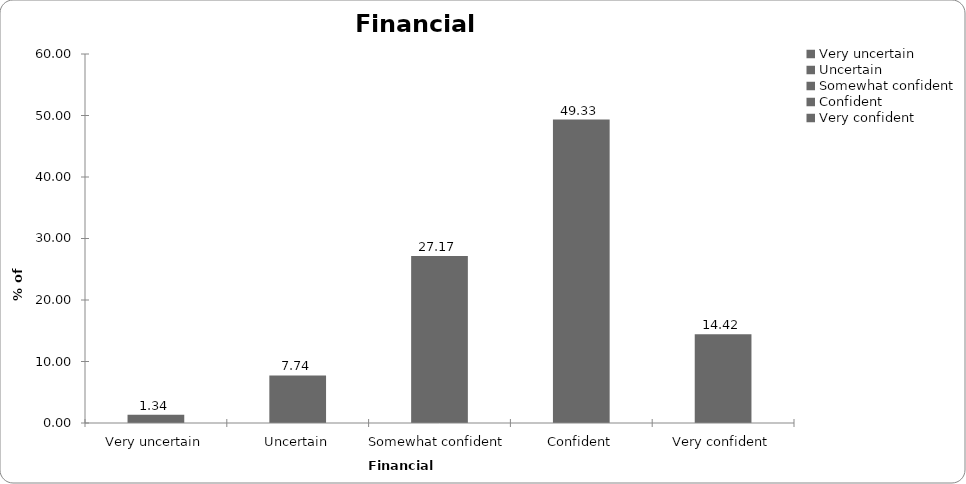
| Category | Financial confidence |
|---|---|
| Very uncertain | 1.335 |
| Uncertain | 7.744 |
| Somewhat confident | 27.17 |
| Confident | 49.332 |
| Very confident | 14.419 |